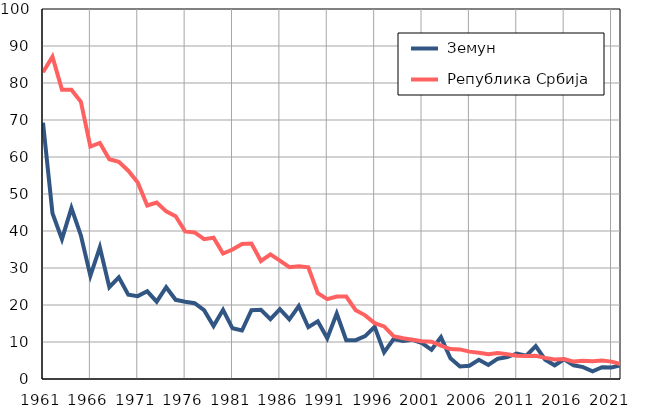
| Category |  Земун |  Република Србија |
|---|---|---|
| 1961.0 | 69.3 | 82.9 |
| 1962.0 | 44.8 | 87.1 |
| 1963.0 | 37.8 | 78.2 |
| 1964.0 | 46.2 | 78.2 |
| 1965.0 | 38.8 | 74.9 |
| 1966.0 | 27.9 | 62.8 |
| 1967.0 | 35.6 | 63.8 |
| 1968.0 | 24.8 | 59.4 |
| 1969.0 | 27.5 | 58.7 |
| 1970.0 | 22.8 | 56.3 |
| 1971.0 | 22.4 | 53.1 |
| 1972.0 | 23.7 | 46.9 |
| 1973.0 | 20.9 | 47.7 |
| 1974.0 | 24.8 | 45.3 |
| 1975.0 | 21.4 | 44 |
| 1976.0 | 20.9 | 39.9 |
| 1977.0 | 20.5 | 39.6 |
| 1978.0 | 18.6 | 37.8 |
| 1979.0 | 14.3 | 38.2 |
| 1980.0 | 18.7 | 33.9 |
| 1981.0 | 13.7 | 35 |
| 1982.0 | 13.1 | 36.5 |
| 1983.0 | 18.6 | 36.6 |
| 1984.0 | 18.7 | 31.9 |
| 1985.0 | 16.2 | 33.7 |
| 1986.0 | 18.9 | 32 |
| 1987.0 | 16.1 | 30.2 |
| 1988.0 | 19.7 | 30.5 |
| 1989.0 | 14 | 30.2 |
| 1990.0 | 15.6 | 23.2 |
| 1991.0 | 11 | 21.6 |
| 1992.0 | 17.7 | 22.3 |
| 1993.0 | 10.5 | 22.3 |
| 1994.0 | 10.5 | 18.6 |
| 1995.0 | 11.6 | 17.2 |
| 1996.0 | 14.1 | 15.1 |
| 1997.0 | 7.2 | 14.2 |
| 1998.0 | 10.8 | 11.6 |
| 1999.0 | 10.3 | 11 |
| 2000.0 | 10.6 | 10.6 |
| 2001.0 | 9.7 | 10.2 |
| 2002.0 | 7.9 | 10.1 |
| 2003.0 | 11.3 | 9 |
| 2004.0 | 5.6 | 8.1 |
| 2005.0 | 3.4 | 8 |
| 2006.0 | 3.6 | 7.4 |
| 2007.0 | 5.2 | 7.1 |
| 2008.0 | 3.8 | 6.7 |
| 2009.0 | 5.5 | 7 |
| 2010.0 | 5.9 | 6.7 |
| 2011.0 | 6.9 | 6.3 |
| 2012.0 | 6.3 | 6.2 |
| 2013.0 | 8.9 | 6.3 |
| 2014.0 | 5.2 | 5.7 |
| 2015.0 | 3.7 | 5.3 |
| 2016.0 | 5.3 | 5.4 |
| 2017.0 | 3.7 | 4.7 |
| 2018.0 | 3.2 | 4.9 |
| 2019.0 | 2.1 | 4.8 |
| 2020.0 | 3.2 | 5 |
| 2021.0 | 3.1 | 4.7 |
| 2022.0 | 3.7 | 4 |